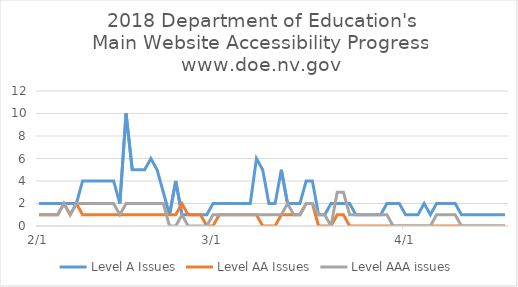
| Category | Level A Issues | Level AA Issues | Level AAA issues |
|---|---|---|---|
| 2018-02-01 05:40:19 | 2 | 1 | 1 |
| 2018-02-02 05:46:34 | 2 | 1 | 1 |
| 2018-02-03 05:45:11 | 2 | 1 | 1 |
| 2018-02-04 05:34:27 | 2 | 1 | 1 |
| 2018-02-05 05:36:05 | 2 | 2 | 2 |
| 2018-02-06 05:39:42 | 2 | 1 | 1 |
| 2018-02-07 07:31:13 | 2 | 2 | 2 |
| 2018-02-08 07:29:34 | 4 | 1 | 2 |
| 2018-02-09 07:23:15 | 4 | 1 | 2 |
| 2018-02-10 07:20:26 | 4 | 1 | 2 |
| 2018-02-11 07:43:54 | 4 | 1 | 2 |
| 2018-02-12 07:48:55 | 4 | 1 | 2 |
| 2018-02-13 08:32:14 | 4 | 1 | 2 |
| 2018-02-14 07:54:14 | 2 | 1 | 1 |
| 2018-02-15 07:51:01 | 10 | 1 | 2 |
| 2018-02-16 08:01:38 | 5 | 1 | 2 |
| 2018-02-17 06:47:57 | 5 | 1 | 2 |
| 2018-02-18 07:20:14 | 5 | 1 | 2 |
| 2018-02-19 07:00:03 | 6 | 1 | 2 |
| 2018-02-20 08:03:28 | 5 | 1 | 2 |
| 2018-02-21 07:02:08 | 3 | 1 | 2 |
| 2018-02-22 07:15:21 | 1 | 1 | 0 |
| 2018-02-23 07:35:04 | 4 | 1 | 0 |
| 2018-02-24 07:00:20 | 1 | 2 | 1 |
| 2018-02-25 06:44:53 | 1 | 1 | 0 |
| 2018-02-26 06:42:18 | 1 | 1 | 0 |
| 2018-02-27 06:54:10 | 1 | 1 | 0 |
| 2018-02-28 06:48:19 | 1 | 0 | 0 |
| 2018-03-01 07:16:40 | 2 | 0 | 1 |
| 2018-03-02 06:55:04 | 2 | 1 | 1 |
| 2018-03-03 06:55:13 | 2 | 1 | 1 |
| 2018-03-05 05:03:50 | 2 | 1 | 1 |
| 2018-03-06 06:44:53 | 2 | 1 | 1 |
| 2018-03-07 07:12:46 | 2 | 1 | 1 |
| 2018-03-08 06:50:44 | 6 | 1 | 1 |
| 2018-03-09 07:23:13 | 5 | 0 | 1 |
| 2018-03-10 07:11:08 | 2 | 0 | 1 |
| 2018-03-11 06:42:37 | 2 | 0 | 1 |
| 2018-03-12 08:32:00 | 5 | 1 | 1 |
| 2018-03-13 07:11:03 | 2 | 1 | 2 |
| 2018-03-14 08:12:12 | 2 | 1 | 1 |
| 2018-03-15 15:36:40 | 2 | 1 | 1 |
| 2018-03-16 11:27:35 | 4 | 2 | 2 |
| 2018-03-17 07:28:03 | 4 | 2 | 2 |
| 2018-03-18 08:26:17 | 1 | 0 | 1 |
| 2018-03-19 06:54:39 | 1 | 0 | 1 |
| 2018-03-20 06:50:06 | 2 | 0 | 0 |
| 2018-03-21 06:43:45 | 2 | 1 | 3 |
| 2018-03-22 06:36:58 | 2 | 1 | 3 |
| 2018-03-23 06:52:23 | 2 | 0 | 1 |
| 2018-03-24 06:41:48 | 1 | 0 | 1 |
| 2018-03-25 22:10:04 | 1 | 0 | 1 |
| 2018-03-26 07:46:24 | 1 | 0 | 1 |
| 2018-03-27 06:56:18 | 1 | 0 | 1 |
| 2018-03-28 07:03:36 | 1 | 0 | 1 |
| 2018-03-29 06:39:29 | 2 | 0 | 1 |
| 2018-03-30 06:58:11 | 2 | 0 | 0 |
| 2018-03-31 07:05:05 | 2 | 0 | 0 |
| 2018-04-01 06:55:21 | 1 | 0 | 0 |
| 2018-04-02 06:57:49 | 1 | 0 | 0 |
| 2018-04-03 09:40:35 | 1 | 0 | 0 |
| 2018-04-04 08:14:08 | 2 | 0 | 0 |
| 2018-04-05 08:00:33 | 1 | 0 | 0 |
| 2018-04-06 07:55:08 | 2 | 0 | 1 |
| 2018-04-07 07:49:07 | 2 | 0 | 1 |
| 2018-04-08 07:37:42 | 2 | 0 | 1 |
| 2018-04-09 07:48:05 | 2 | 0 | 1 |
| 2018-04-10 08:03:34 | 1 | 0 | 0 |
| 2018-04-11 07:50:00 | 1 | 0 | 0 |
| 2018-04-12 08:14:19 | 1 | 0 | 0 |
| 2018-04-13 07:52:28 | 1 | 0 | 0 |
| 2018-04-14 08:03:08 | 1 | 0 | 0 |
| 2018-04-15 07:56:40 | 1 | 0 | 0 |
| 2018-04-16 08:00:15 | 1 | 0 | 0 |
| 2018-04-17 00:04:09 | 1 | 0 | 0 |